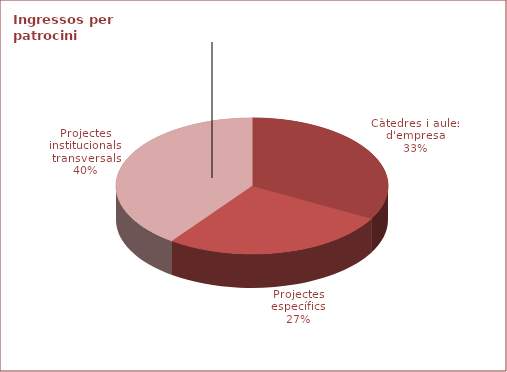
| Category | Series 0 |
|---|---|
| Càtedres i aules d'empresa | 33 |
| Projectes específics | 27 |
| Projectes institucionals transversals | 40 |